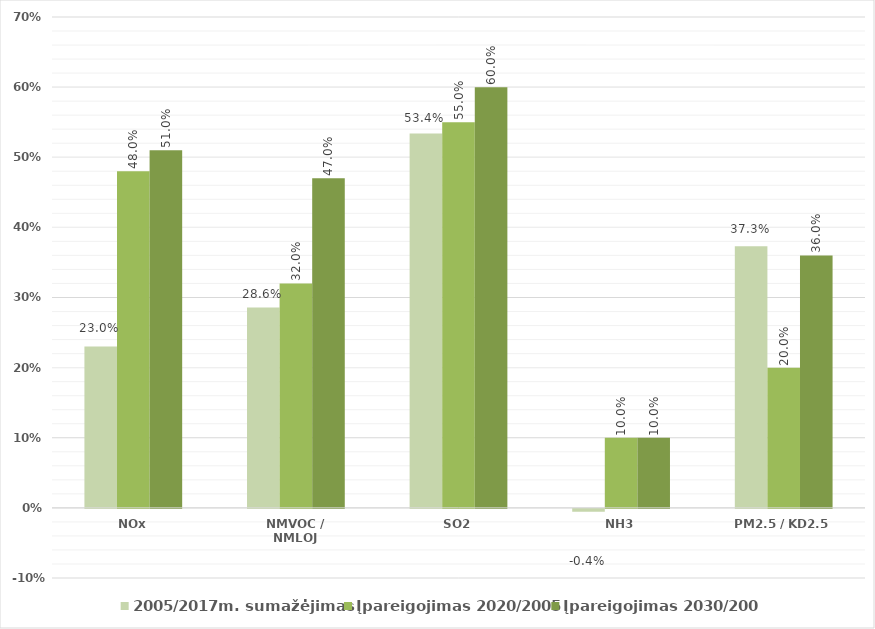
| Category | 2005/2017m. sumažėjimas | Įpareigojimas 2020/2005 | Įpareigojimas 2030/2005 |
|---|---|---|---|
| NOx | 0.23 | 0.48 | 0.51 |
| NMVOC / NMLOJ | 0.286 | 0.32 | 0.47 |
| SO2 | 0.534 | 0.55 | 0.6 |
| NH3 | -0.004 | 0.1 | 0.1 |
| PM2.5 / KD2.5 | 0.373 | 0.2 | 0.36 |